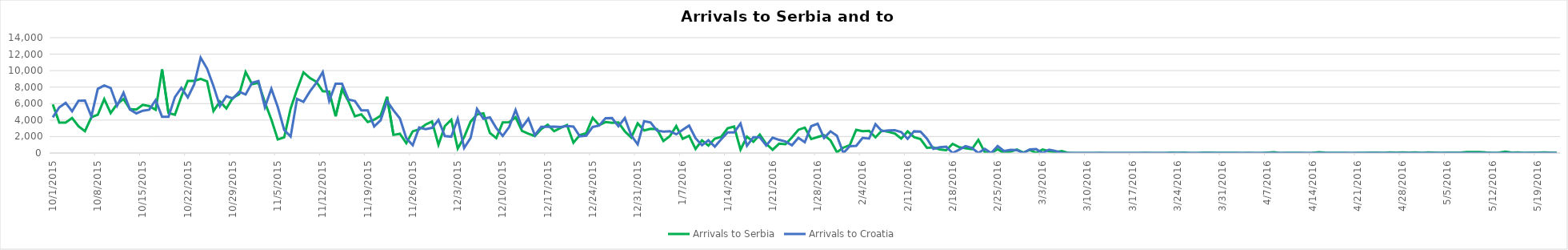
| Category | Arrivals to Serbia | Arrivals to Croatia |
|---|---|---|
| 10/1/15 | 5900 | 4344 |
| 10/2/15 | 3700 | 5546 |
| 10/3/15 | 3700 | 6086 |
| 10/4/15 | 4250 | 5065 |
| 10/5/15 | 3250 | 6338 |
| 10/6/15 | 2650 | 6370 |
| 10/7/15 | 4350 | 4446 |
| 10/8/15 | 4650 | 7798 |
| 10/9/15 | 6550 | 8201 |
| 10/10/15 | 4850 | 7896 |
| 10/11/15 | 5950 | 5732 |
| 10/12/15 | 6556 | 7317 |
| 10/13/15 | 5330 | 5286 |
| 10/14/15 | 5280 | 4814 |
| 10/15/15 | 5850 | 5138 |
| 10/16/15 | 5700 | 5260 |
| 10/17/15 | 5250 | 6415 |
| 10/18/15 | 10150 | 4390 |
| 10/19/15 | 4850 | 4388 |
| 10/20/15 | 4650 | 6793 |
| 10/21/15 | 6850 | 7900 |
| 10/22/15 | 8750 | 6748 |
| 10/23/15 | 8750 | 8348 |
| 10/24/15 | 9000 | 11570 |
| 10/25/15 | 8700 | 10249 |
| 10/26/15 | 5100 | 8128 |
| 10/27/15 | 6257 | 5683 |
| 10/28/15 | 5415 | 6900 |
| 10/29/15 | 6700 | 6615 |
| 10/30/15 | 7138 | 7429 |
| 10/31/15 | 9834 | 7110 |
| 11/1/15 | 8354 | 8534 |
| 11/2/15 | 8521 | 8746 |
| 11/3/15 | 6129 | 5573 |
| 11/4/15 | 4073 | 7792 |
| 11/5/15 | 1652 | 5587 |
| 11/6/15 | 1906 | 2809 |
| 11/7/15 | 5397 | 2000 |
| 11/8/15 | 7695 | 6579 |
| 11/9/15 | 9785 | 6214 |
| 11/10/15 | 9107 | 7474 |
| 11/11/15 | 8648 | 8524 |
| 11/12/15 | 7500 | 9823 |
| 11/13/15 | 7464 | 6314 |
| 11/14/15 | 4453 | 8405 |
| 11/15/15 | 7734 | 8415 |
| 11/16/15 | 6267 | 6490 |
| 11/17/15 | 4460 | 6304 |
| 11/18/15 | 4694 | 5180 |
| 11/19/15 | 3765 | 5167 |
| 11/20/15 | 4042 | 3230 |
| 11/21/15 | 4527 | 3977 |
| 11/22/15 | 6826 | 6305 |
| 11/23/15 | 2201 | 5184 |
| 11/24/15 | 2335 | 4203 |
| 11/25/15 | 1194 | 1808 |
| 11/26/15 | 2636 | 952 |
| 11/27/15 | 2878 | 3095 |
| 11/28/15 | 3454 | 2886 |
| 11/29/15 | 3825 | 3060 |
| 11/30/15 | 1009 | 4009 |
| 12/1/15 | 3284 | 2066 |
| 12/2/15 | 4040 | 1982 |
| 12/3/15 | 553 | 4174 |
| 12/4/15 | 1927 | 611 |
| 12/5/15 | 3799 | 1835 |
| 12/6/15 | 4686 | 5339 |
| 12/7/15 | 4823 | 4162 |
| 12/8/15 | 2437 | 4335 |
| 12/9/15 | 1807 | 3027 |
| 12/10/15 | 3723 | 2076 |
| 12/11/15 | 3747 | 3149 |
| 12/12/15 | 4339 | 5225 |
| 12/13/15 | 2698 | 3112 |
| 12/14/15 | 2353 | 4174 |
| 12/15/15 | 2067 | 2160 |
| 12/16/15 | 2916 | 3177 |
| 12/17/15 | 3438 | 3192 |
| 12/18/15 | 2649 | 3200 |
| 12/19/15 | 3052 | 3156 |
| 12/20/15 | 3405 | 3276 |
| 12/21/15 | 1253 | 3210 |
| 12/22/15 | 2186 | 2027 |
| 12/23/15 | 2415 | 2116 |
| 12/24/15 | 4279 | 3166 |
| 12/25/15 | 3390 | 3339 |
| 12/26/15 | 3757 | 4241 |
| 12/27/15 | 3674 | 4251 |
| 12/28/15 | 3708 | 3249 |
| 12/29/15 | 2629 | 4253 |
| 12/30/15 | 1879 | 2132 |
| 12/31/15 | 3602 | 1058 |
| 1/1/16 | 2745 | 3869 |
| 1/2/16 | 2947 | 3710 |
| 1/3/16 | 2889 | 2732 |
| 1/4/16 | 1462 | 2591 |
| 1/5/16 | 2041 | 2650 |
| 1/6/16 | 3273 | 2273 |
| 1/7/16 | 1715 | 2814 |
| 1/8/16 | 2100 | 3332 |
| 1/9/16 | 489 | 1799 |
| 1/10/16 | 1538 | 942 |
| 1/11/16 | 905 | 1549 |
| 1/12/16 | 1743 | 769 |
| 1/13/16 | 1973 | 1679 |
| 1/14/16 | 3006 | 2502 |
| 1/15/16 | 3213 | 2493 |
| 1/16/16 | 415 | 3579 |
| 1/17/16 | 1995 | 878 |
| 1/18/16 | 1362 | 1930 |
| 1/19/16 | 2244 | 1917 |
| 1/20/16 | 1113 | 914 |
| 1/21/16 | 397 | 1865 |
| 1/22/16 | 1134 | 1599 |
| 1/23/16 | 1064 | 1394 |
| 1/24/16 | 1895 | 946 |
| 1/25/16 | 2827 | 1847 |
| 1/26/16 | 3091 | 1309 |
| 1/27/16 | 1695 | 3256 |
| 1/28/16 | 1940 | 3565 |
| 1/29/16 | 2167 | 1843 |
| 1/30/16 | 1540 | 2641 |
| 1/31/16 | 103 | 2098 |
| 2/1/16 | 660 | 0 |
| 2/2/16 | 966 | 822 |
| 2/3/16 | 2825 | 881 |
| 2/4/16 | 2653 | 1836 |
| 2/5/16 | 2694 | 1750 |
| 2/6/16 | 1901 | 3510 |
| 2/7/16 | 2739 | 2658 |
| 2/8/16 | 2563 | 2736 |
| 2/9/16 | 2379 | 2764 |
| 2/10/16 | 1758 | 2544 |
| 2/11/16 | 2636 | 1716 |
| 2/12/16 | 1923 | 2635 |
| 2/13/16 | 1699 | 2595 |
| 2/14/16 | 641 | 1749 |
| 2/15/16 | 691 | 512 |
| 2/16/16 | 443 | 701 |
| 2/17/16 | 345 | 769 |
| 2/18/16 | 1117 | 0 |
| 2/19/16 | 713 | 408 |
| 2/20/16 | 580 | 834 |
| 2/21/16 | 476 | 630 |
| 2/22/16 | 1595 | 0 |
| 2/23/16 | 106 | 507 |
| 2/24/16 | 1 | 0 |
| 2/25/16 | 475 | 841 |
| 2/26/16 | 0 | 250 |
| 2/27/16 | 158 | 385 |
| 2/28/16 | 431 | 358 |
| 2/29/16 | 69 | 0 |
| 3/1/16 | 372 | 436 |
| 3/2/16 | 16 | 476 |
| 3/3/16 | 428 | 0 |
| 3/4/16 | 218 | 410 |
| 3/5/16 | 115 | 253 |
| 3/6/16 | 236 | 0 |
| 3/7/16 | 14 | 0 |
| 3/8/16 | 0 | 0 |
| 3/9/16 | 3 | 0 |
| 3/10/16 | 0 | 0 |
| 3/11/16 | 0 | 0 |
| 3/12/16 | 35 | 0 |
| 3/13/16 | 12 | 0 |
| 3/14/16 | 0 | 0 |
| 3/15/16 | 0 | 0 |
| 3/16/16 | 0 | 0 |
| 3/17/16 | 0 | 0 |
| 3/18/16 | 0 | 0 |
| 3/19/16 | 30 | 0 |
| 3/20/16 | 0 | 0 |
| 3/21/16 | 0 | 0 |
| 3/22/16 | 0 | 0 |
| 3/23/16 | 49 | 0 |
| 3/24/16 | 31 | 0 |
| 3/25/16 | 40 | 0 |
| 3/26/16 | 0 | 0 |
| 3/27/16 | 4 | 0 |
| 3/28/16 | 42 | 0 |
| 3/29/16 | 37 | 0 |
| 3/30/16 | 21 | 0 |
| 3/31/16 | 14 | 0 |
| 4/1/16 | 28 | 0 |
| 4/2/16 | 32 | 0 |
| 4/3/16 | 10 | 0 |
| 4/4/16 | 28 | 0 |
| 4/5/16 | 0 | 0 |
| 4/6/16 | 4 | 0 |
| 4/7/16 | 58 | 0 |
| 4/8/16 | 93 | 0 |
| 4/9/16 | 8 | 0 |
| 4/10/16 | 30 | 0 |
| 4/11/16 | 34 | 0 |
| 4/12/16 | 22 | 0 |
| 4/13/16 | 3 | 0 |
| 4/14/16 | 34 | 0 |
| 4/15/16 | 90 | 0 |
| 4/16/16 | 41 | 0 |
| 4/17/16 | 15 | 0 |
| 4/18/16 | 17 | 0 |
| 4/19/16 | 34 | 0 |
| 4/20/16 | 5 | 0 |
| 4/21/16 | 31 | 0 |
| 4/22/16 | 19 | 0 |
| 4/23/16 | 45 | 0 |
| 4/24/16 | 38 | 0 |
| 4/25/16 | 34 | 0 |
| 4/26/16 | 73 | 0 |
| 4/27/16 | 54 | 0 |
| 4/28/16 | 69 | 0 |
| 4/29/16 | 59 | 0 |
| 4/30/16 | 80 | 0 |
| 5/1/16 | 26 | 0 |
| 5/2/16 | 81 | 0 |
| 5/3/16 | 50 | 0 |
| 5/4/16 | 25 | 0 |
| 5/5/16 | 58 | 0 |
| 5/6/16 | 49 | 0 |
| 5/7/16 | 59 | 0 |
| 5/8/16 | 128 | 0 |
| 5/9/16 | 113 | 0 |
| 5/10/16 | 119 | 0 |
| 5/11/16 | 62 | 0 |
| 5/12/16 | 33 | 0 |
| 5/13/16 | 51 | 0 |
| 5/14/16 | 161 | 0 |
| 5/15/16 | 45 | 0 |
| 5/16/16 | 71 | 0 |
| 5/17/16 | 17 | 0 |
| 5/18/16 | 44 | 0 |
| 5/19/16 | 55 | 0 |
| 5/20/16 | 74 | 0 |
| 5/21/16 | 39 | 0 |
| 5/22/16 | 16 | 0 |